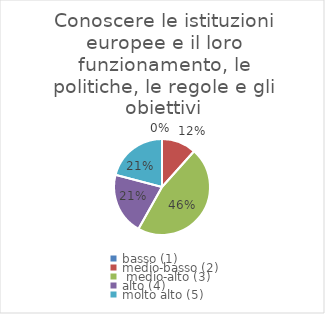
| Category | Conoscere le istituzioni europee e il loro funzionamento, le politiche, le regole e gli obiettivi |
|---|---|
| basso (1) | 0 |
| medio-basso (2) | 0.116 |
|  medio-alto (3) | 0.465 |
| alto (4) | 0.209 |
| molto alto (5) | 0.209 |